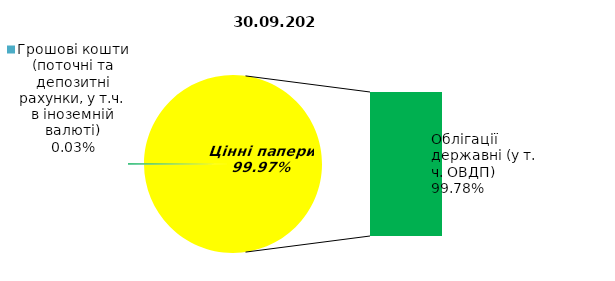
| Category | Series 0 |
|---|---|
| Грошові кошти (поточні та депозитні рахунки, у т.ч. в іноземній валюті) | 0.05 |
| Банківські метали | 0 |
| Нерухомість | 0 |
| Інші активи | 0.31 |
| Акції | 0 |
| Облігації підприємств | 0 |
| Муніципальні облігації | 0 |
| Облігації державні (у т. ч. ОВДП) | 161.605 |
| Іпотечні сертифікати | 0 |